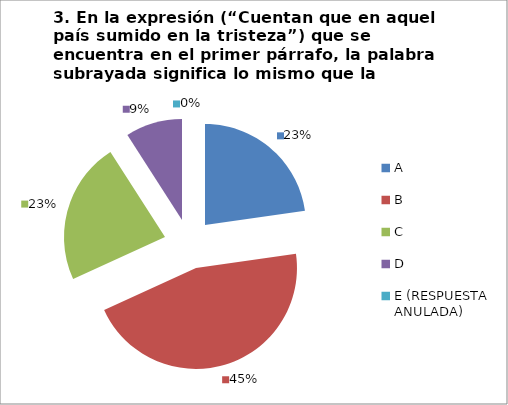
| Category | CANTIDAD DE RESPUESTAS PREGUNTA (3) | PORCENTAJE |
|---|---|---|
| A | 5 | 0.227 |
| B | 10 | 0.455 |
| C | 5 | 0.227 |
| D | 2 | 0.091 |
| E (RESPUESTA ANULADA) | 0 | 0 |